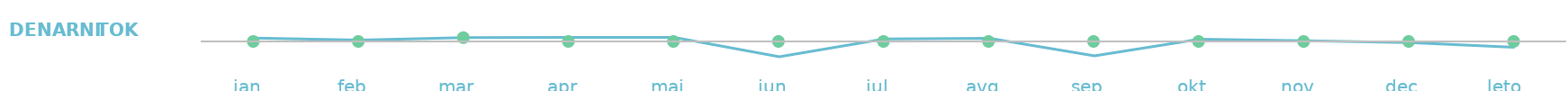
| Category | Denarni tok |
|---|---|
| jan  | 169 |
| feb  | 69 |
| mar  | 192 |
| apr  | 199 |
| maj  | 204 |
| jun  | -771 |
| jul  | 124 |
| avg  | 154 |
| sep  | -721 |
| okt  | 109 |
| nov  | 34 |
| dec  | -61 |
| leto   | -299 |